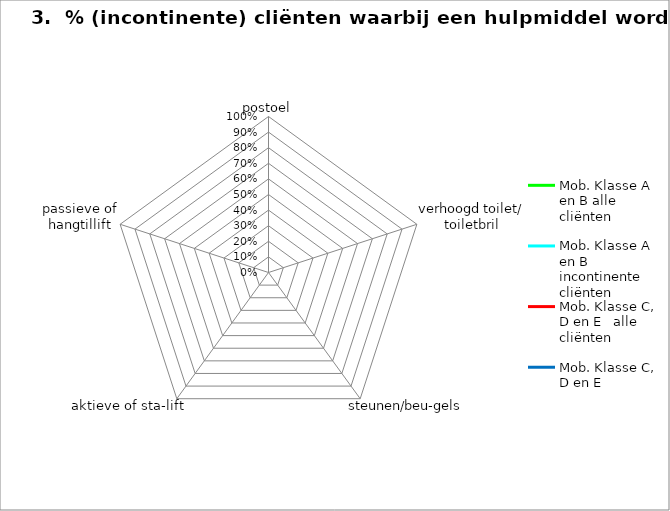
| Category | Mob. Klasse A en B alle cliënten | Mob. Klasse A en B incontinente cliënten | Mob. Klasse C, D en E   alle cliënten | Mob. Klasse C, D en E incontinente cliënten |
|---|---|---|---|---|
| postoel | 0 | 0 | 0 | 0 |
| verhoogd toilet/ toiletbril | 0 | 0 | 0 | 0 |
| steunen/beu-gels | 0 | 0 | 0 | 0 |
| aktieve of sta-lift | 0 | 0 | 0 | 0 |
| passieve of hangtillift | 0 | 0 | 0 | 0 |